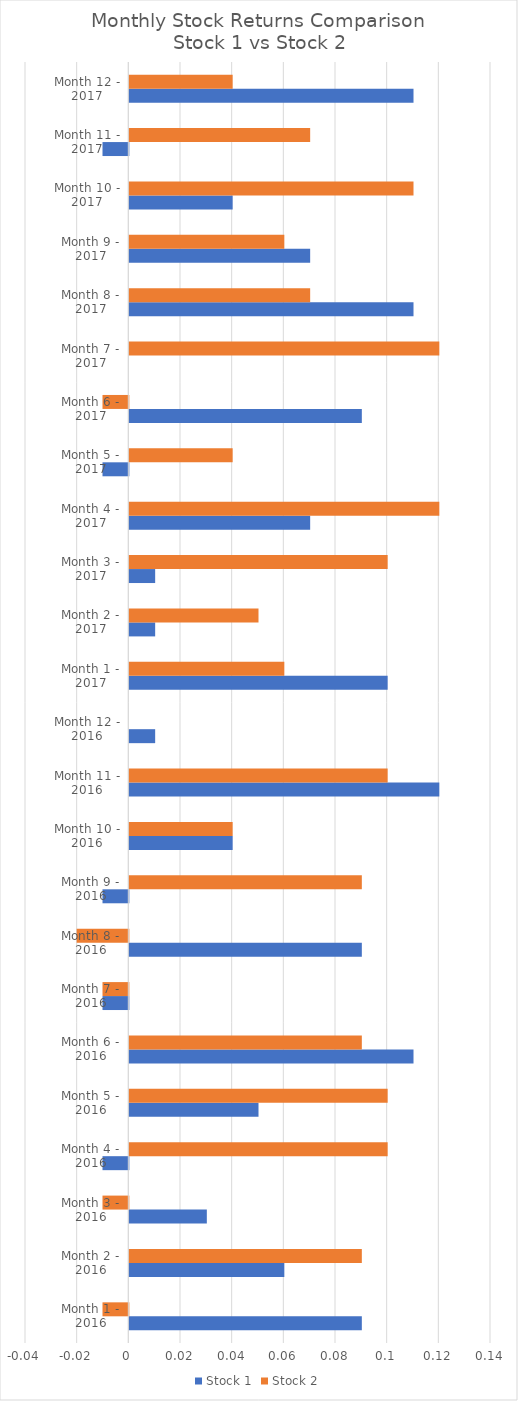
| Category | Stock 1 | Stock 2 |
|---|---|---|
| Month 1 - 2016 | 0.09 | -0.01 |
| Month 2 - 2016 | 0.06 | 0.09 |
| Month 3 - 2016 | 0.03 | -0.01 |
| Month 4 - 2016 | -0.01 | 0.1 |
| Month 5 - 2016 | 0.05 | 0.1 |
| Month 6 - 2016 | 0.11 | 0.09 |
| Month 7 - 2016 | -0.01 | -0.01 |
| Month 8 - 2016 | 0.09 | -0.02 |
| Month 9 - 2016 | -0.01 | 0.09 |
| Month 10 - 2016 | 0.04 | 0.04 |
| Month 11 - 2016 | 0.12 | 0.1 |
| Month 12 - 2016 | 0.01 | 0 |
| Month 1 - 2017 | 0.1 | 0.06 |
| Month 2 - 2017 | 0.01 | 0.05 |
| Month 3 - 2017 | 0.01 | 0.1 |
| Month 4 - 2017 | 0.07 | 0.12 |
| Month 5 - 2017 | -0.01 | 0.04 |
| Month 6 - 2017 | 0.09 | -0.01 |
| Month 7 - 2017 | 0 | 0.12 |
| Month 8 - 2017 | 0.11 | 0.07 |
| Month 9 - 2017 | 0.07 | 0.06 |
| Month 10 - 2017 | 0.04 | 0.11 |
| Month 11 - 2017 | -0.01 | 0.07 |
| Month 12 - 2017 | 0.11 | 0.04 |